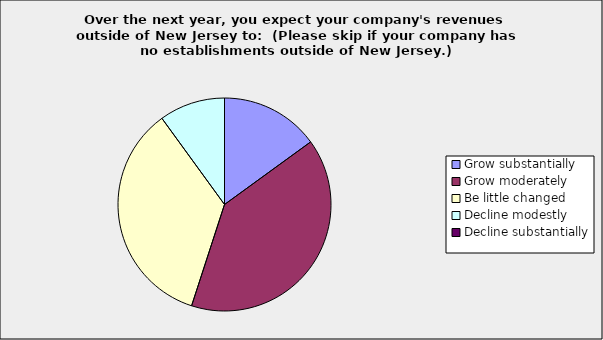
| Category | Series 0 |
|---|---|
| Grow substantially | 0.15 |
| Grow moderately | 0.4 |
| Be little changed | 0.35 |
| Decline modestly | 0.1 |
| Decline substantially | 0 |